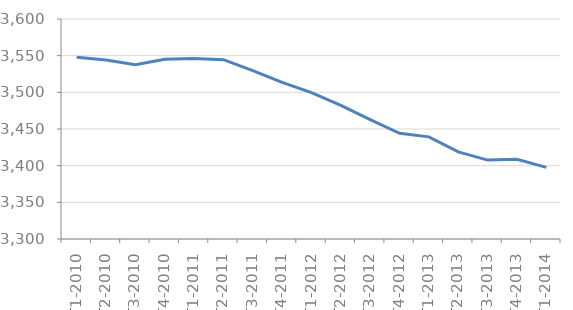
| Category | Series 0 |
|---|---|
| T1-2010 | 3548 |
| T2-2010 | 3544 |
| T3-2010 | 3537.7 |
| T4-2010 | 3545.1 |
| T1-2011 | 3546.1 |
| T2-2011 | 3544.6 |
| T3-2011 | 3529.5 |
| T4-2011 | 3513.6 |
| T1-2012 | 3499.7 |
| T2-2012 | 3482.2 |
| T3-2012 | 3462.8 |
| T4-2012 | 3444.1 |
| T1-2013 | 3439.3 |
| T2-2013 | 3418.7 |
| T3-2013 | 3407.6 |
| T4-2013 | 3408.6 |
| T1-2014 | 3397.7 |